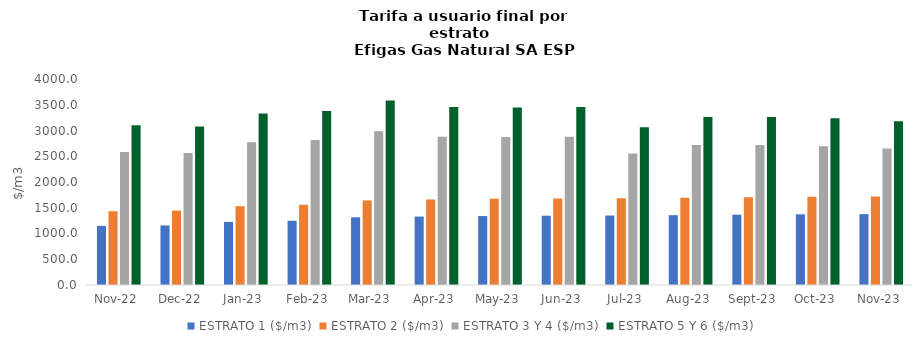
| Category | ESTRATO 1 ($/m3) | ESTRATO 2 ($/m3) | ESTRATO 3 Y 4 ($/m3) | ESTRATO 5 Y 6 ($/m3) |
|---|---|---|---|---|
| 2022-11-01 | 1147.2 | 1432.78 | 2584.83 | 3101.796 |
| 2022-12-01 | 1156.03 | 1443.8 | 2563.93 | 3076.716 |
| 2023-01-01 | 1224.77 | 1529.93 | 2774 | 3328.8 |
| 2023-02-01 | 1247.16 | 1558.32 | 2816 | 3379.2 |
| 2023-03-01 | 1314.94 | 1642.54 | 2985.304 | 3582.364 |
| 2023-04-01 | 1328.75 | 1659.79 | 2880.614 | 3456.737 |
| 2023-05-01 | 1339.14 | 1672.77 | 2874.12 | 3448.944 |
| 2023-06-01 | 1344.99 | 1680.07 | 2880.614 | 3456.737 |
| 2023-07-01 | 1349.02 | 1685.11 | 2551.788 | 3062.145 |
| 2023-08-01 | 1355.78 | 1693.55 | 2720.369 | 3264.443 |
| 2023-09-01 | 1365.26 | 1705.39 | 2717.396 | 3260.875 |
| 2023-10-01 | 1372.52 | 1714.46 | 2696.262 | 3235.514 |
| 2023-11-01 | 1375.95 | 1718.74 | 2650.142 | 3180.171 |